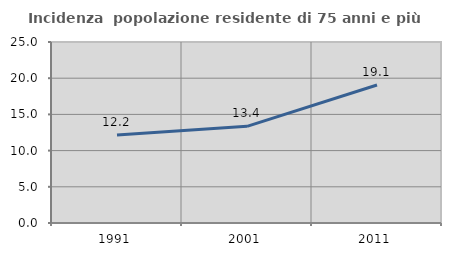
| Category | Incidenza  popolazione residente di 75 anni e più |
|---|---|
| 1991.0 | 12.167 |
| 2001.0 | 13.352 |
| 2011.0 | 19.059 |